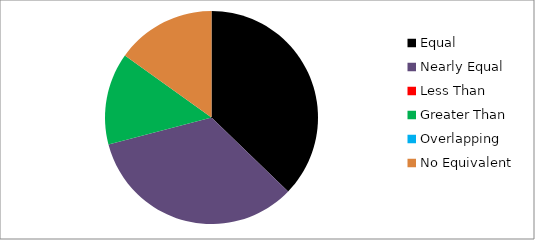
| Category | Series 0 |
|---|---|
| Equal | 32 |
| Nearly Equal | 29 |
| Less Than | 0 |
| Greater Than | 12 |
| Overlapping | 0 |
| No Equivalent | 13 |